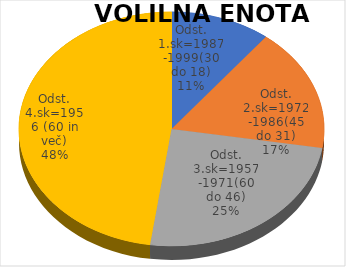
| Category | VOLILNA ENOTA 02 |
|---|---|
| Odst. 1.sk=1987-1999(30 do 18) | 2.53 |
| Odst. 2.sk=1972-1986(45 do 31) | 4.06 |
| Odst. 3.sk=1957-1971(60 do 46) | 5.88 |
| Odst. 4.sk=1956 (60 in več) | 11.4 |